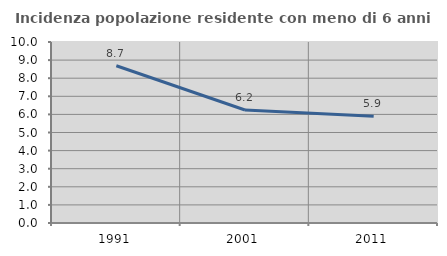
| Category | Incidenza popolazione residente con meno di 6 anni |
|---|---|
| 1991.0 | 8.686 |
| 2001.0 | 6.245 |
| 2011.0 | 5.897 |